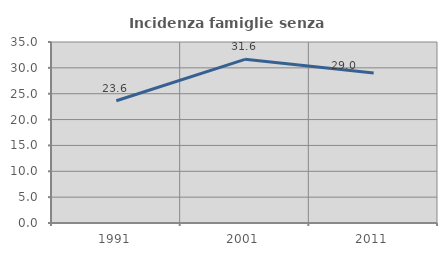
| Category | Incidenza famiglie senza nuclei |
|---|---|
| 1991.0 | 23.642 |
| 2001.0 | 31.643 |
| 2011.0 | 29.01 |